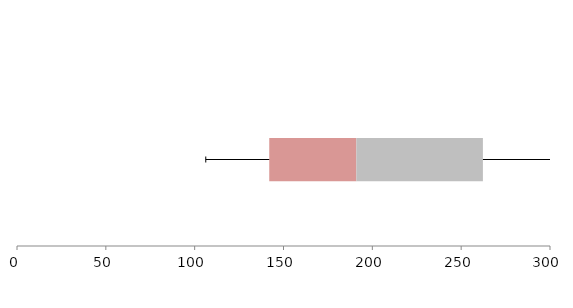
| Category | Series 1 | Series 2 | Series 3 |
|---|---|---|---|
| 0 | 141.979 | 49.03 | 71.228 |